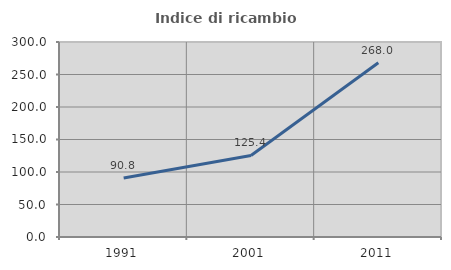
| Category | Indice di ricambio occupazionale  |
|---|---|
| 1991.0 | 90.792 |
| 2001.0 | 125.429 |
| 2011.0 | 267.965 |